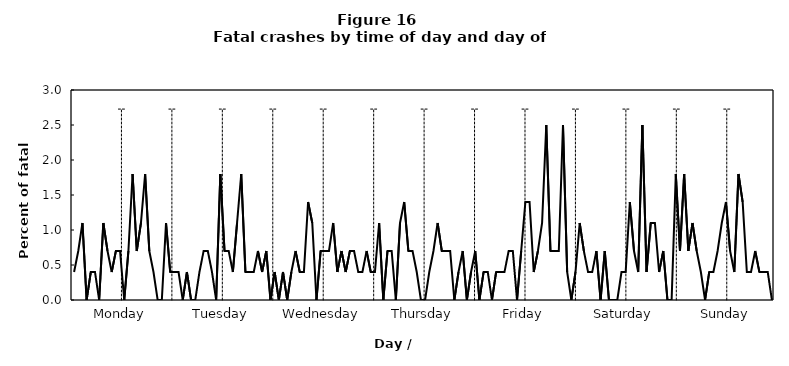
| Category | Fatal crashes |
|---|---|
| 0 | 0.4 |
| 1 | 0.7 |
| 2 | 1.1 |
| 3 | 0 |
| 4 | 0.4 |
| 5 | 0.4 |
| 6 | 0 |
| 7 | 1.1 |
| 8 | 0.7 |
| 9 | 0.4 |
| 10 | 0.7 |
| 11 | 0.7 |
| 12 | 0 |
| 13 | 0.7 |
| 14 | 1.8 |
| 15 | 0.7 |
| 16 | 1.1 |
| 17 | 1.8 |
| 18 | 0.7 |
| 19 | 0.4 |
| 20 | 0 |
| 21 | 0 |
| 22 | 1.1 |
| 23 | 0.4 |
| 24 | 0.4 |
| 25 | 0.4 |
| 26 | 0 |
| 27 | 0.4 |
| 28 | 0 |
| 29 | 0 |
| 30 | 0.4 |
| 31 | 0.7 |
| 32 | 0.7 |
| 33 | 0.4 |
| 34 | 0 |
| 35 | 1.8 |
| 36 | 0.7 |
| 37 | 0.7 |
| 38 | 0.4 |
| 39 | 1.1 |
| 40 | 1.8 |
| 41 | 0.4 |
| 42 | 0.4 |
| 43 | 0.4 |
| 44 | 0.7 |
| 45 | 0.4 |
| 46 | 0.7 |
| 47 | 0 |
| 48 | 0.4 |
| 49 | 0 |
| 50 | 0.4 |
| 51 | 0 |
| 52 | 0.4 |
| 53 | 0.7 |
| 54 | 0.4 |
| 55 | 0.4 |
| 56 | 1.4 |
| 57 | 1.1 |
| 58 | 0 |
| 59 | 0.7 |
| 60 | 0.7 |
| 61 | 0.7 |
| 62 | 1.1 |
| 63 | 0.4 |
| 64 | 0.7 |
| 65 | 0.4 |
| 66 | 0.7 |
| 67 | 0.7 |
| 68 | 0.4 |
| 69 | 0.4 |
| 70 | 0.7 |
| 71 | 0.4 |
| 72 | 0.4 |
| 73 | 1.1 |
| 74 | 0 |
| 75 | 0.7 |
| 76 | 0.7 |
| 77 | 0 |
| 78 | 1.1 |
| 79 | 1.4 |
| 80 | 0.7 |
| 81 | 0.7 |
| 82 | 0.4 |
| 83 | 0 |
| 84 | 0 |
| 85 | 0.4 |
| 86 | 0.7 |
| 87 | 1.1 |
| 88 | 0.7 |
| 89 | 0.7 |
| 90 | 0.7 |
| 91 | 0 |
| 92 | 0.4 |
| 93 | 0.7 |
| 94 | 0 |
| 95 | 0.4 |
| 96 | 0.7 |
| 97 | 0 |
| 98 | 0.4 |
| 99 | 0.4 |
| 100 | 0 |
| 101 | 0.4 |
| 102 | 0.4 |
| 103 | 0.4 |
| 104 | 0.7 |
| 105 | 0.7 |
| 106 | 0 |
| 107 | 0.7 |
| 108 | 1.4 |
| 109 | 1.4 |
| 110 | 0.4 |
| 111 | 0.7 |
| 112 | 1.1 |
| 113 | 2.5 |
| 114 | 0.7 |
| 115 | 0.7 |
| 116 | 0.7 |
| 117 | 2.5 |
| 118 | 0.4 |
| 119 | 0 |
| 120 | 0.4 |
| 121 | 1.1 |
| 122 | 0.7 |
| 123 | 0.4 |
| 124 | 0.4 |
| 125 | 0.7 |
| 126 | 0 |
| 127 | 0.7 |
| 128 | 0 |
| 129 | 0 |
| 130 | 0 |
| 131 | 0.4 |
| 132 | 0.4 |
| 133 | 1.4 |
| 134 | 0.7 |
| 135 | 0.4 |
| 136 | 2.5 |
| 137 | 0.4 |
| 138 | 1.1 |
| 139 | 1.1 |
| 140 | 0.4 |
| 141 | 0.7 |
| 142 | 0 |
| 143 | 0 |
| 144 | 1.8 |
| 145 | 0.7 |
| 146 | 1.8 |
| 147 | 0.7 |
| 148 | 1.1 |
| 149 | 0.7 |
| 150 | 0.4 |
| 151 | 0 |
| 152 | 0.4 |
| 153 | 0.4 |
| 154 | 0.7 |
| 155 | 1.1 |
| 156 | 1.4 |
| 157 | 0.7 |
| 158 | 0.4 |
| 159 | 1.8 |
| 160 | 1.4 |
| 161 | 0.4 |
| 162 | 0.4 |
| 163 | 0.7 |
| 164 | 0.4 |
| 165 | 0.4 |
| 166 | 0.4 |
| 167 | 0 |